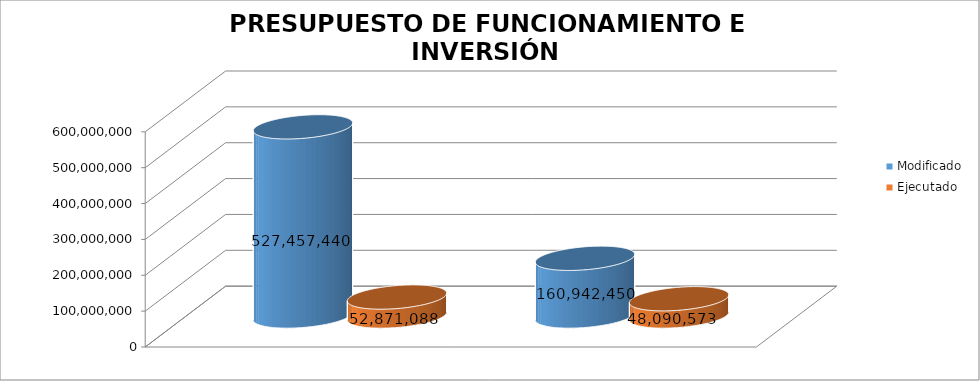
| Category | Modificado | Ejecutado | Series 2 |
|---|---|---|---|
| 0 | 160942450 | 48090573.17 |  |